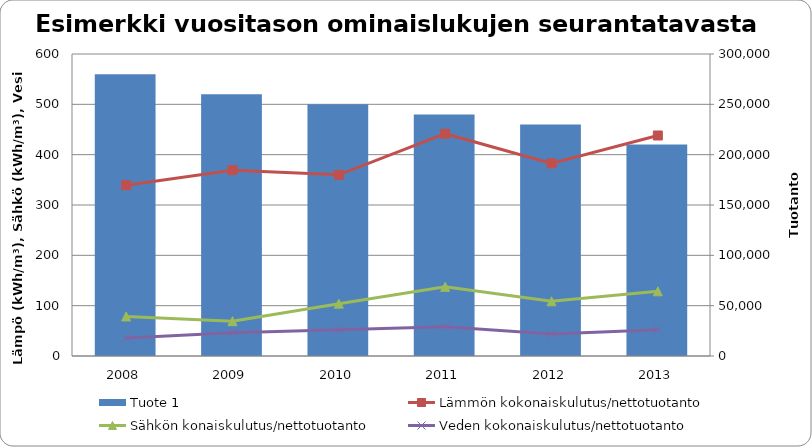
| Category | Tuote 1 |
|---|---|
| 2008.0 | 280000 |
| 2009.0 | 260000 |
| 2010.0 | 250000 |
| 2011.0 | 240000 |
| 2012.0 | 230000 |
| 2013.0 | 210000 |